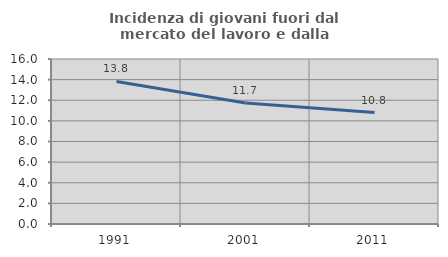
| Category | Incidenza di giovani fuori dal mercato del lavoro e dalla formazione  |
|---|---|
| 1991.0 | 13.82 |
| 2001.0 | 11.737 |
| 2011.0 | 10.805 |